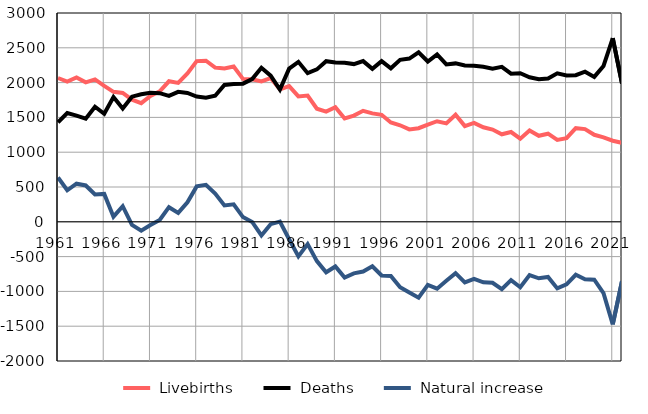
| Category |  Livebirths |  Deaths |  Natural increase |
|---|---|---|---|
| 1961.0 | 2066 | 1429 | 637 |
| 1962.0 | 2015 | 1562 | 453 |
| 1963.0 | 2073 | 1526 | 547 |
| 1964.0 | 2003 | 1481 | 522 |
| 1965.0 | 2046 | 1654 | 392 |
| 1966.0 | 1953 | 1552 | 401 |
| 1967.0 | 1867 | 1793 | 74 |
| 1968.0 | 1852 | 1628 | 224 |
| 1969.0 | 1754 | 1798 | -44 |
| 1970.0 | 1705 | 1833 | -128 |
| 1971.0 | 1808 | 1853 | -45 |
| 1972.0 | 1874 | 1848 | 26 |
| 1973.0 | 2019 | 1809 | 210 |
| 1974.0 | 1995 | 1867 | 128 |
| 1975.0 | 2133 | 1852 | 281 |
| 1976.0 | 2309 | 1800 | 509 |
| 1977.0 | 2314 | 1782 | 532 |
| 1978.0 | 2217 | 1812 | 405 |
| 1979.0 | 2202 | 1967 | 235 |
| 1980.0 | 2232 | 1980 | 252 |
| 1981.0 | 2053 | 1985 | 68 |
| 1982.0 | 2048 | 2050 | -2 |
| 1983.0 | 2016 | 2212 | -196 |
| 1984.0 | 2065 | 2099 | -34 |
| 1985.0 | 1903 | 1900 | 3 |
| 1986.0 | 1950 | 2201 | -251 |
| 1987.0 | 1801 | 2298 | -497 |
| 1988.0 | 1814 | 2135 | -321 |
| 1989.0 | 1625 | 2190 | -565 |
| 1990.0 | 1583 | 2308 | -725 |
| 1991.0 | 1646 | 2288 | -642 |
| 1992.0 | 1485 | 2285 | -800 |
| 1993.0 | 1526 | 2266 | -740 |
| 1994.0 | 1595 | 2309 | -714 |
| 1995.0 | 1558 | 2198 | -640 |
| 1996.0 | 1537 | 2309 | -772 |
| 1997.0 | 1427 | 2205 | -778 |
| 1998.0 | 1387 | 2327 | -940 |
| 1999.0 | 1328 | 2345 | -1017 |
| 2000.0 | 1345 | 2436 | -1091 |
| 2001.0 | 1397 | 2303 | -906 |
| 2002.0 | 1445 | 2406 | -961 |
| 2003.0 | 1414 | 2262 | -848 |
| 2004.0 | 1538 | 2276 | -738 |
| 2005.0 | 1376 | 2246 | -870 |
| 2006.0 | 1422 | 2241 | -819 |
| 2007.0 | 1358 | 2228 | -870 |
| 2008.0 | 1325 | 2201 | -876 |
| 2009.0 | 1257 | 2226 | -969 |
| 2010.0 | 1290 | 2128 | -838 |
| 2011.0 | 1194 | 2134 | -940 |
| 2012.0 | 1311 | 2077 | -766 |
| 2013.0 | 1236 | 2048 | -812 |
| 2014.0 | 1266 | 2059 | -793 |
| 2015.0 | 1176 | 2133 | -957 |
| 2016.0 | 1202 | 2102 | -900 |
| 2017.0 | 1345 | 2106 | -761 |
| 2018.0 | 1332 | 2157 | -825 |
| 2019.0 | 1250 | 2082 | -832 |
| 2020.0 | 1213 | 2239 | -1026 |
| 2021.0 | 1165 | 2638 | -1473 |
| 2022.0 | 1135 | 1988 | -853 |